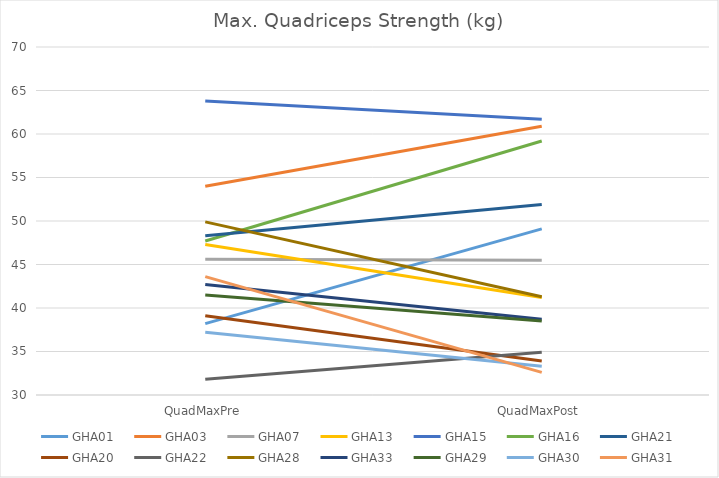
| Category | GHA01 | GHA03 | GHA07 | GHA13 | GHA15 | GHA16 | GHA21 | GHA20 | GHA22 | GHA28 | GHA33 | GHA29 | GHA30 | GHA31 |
|---|---|---|---|---|---|---|---|---|---|---|---|---|---|---|
| QuadMaxPre | 38.2 | 54 | 45.6 | 47.3 | 63.8 | 47.7 | 48.3 | 39.1 | 31.8 | 49.9 | 42.7 | 41.5 | 37.2 | 43.6 |
| QuadMaxPost | 49.1 | 60.9 | 45.5 | 41.2 | 61.7 | 59.2 | 51.9 | 33.9 | 34.9 | 41.3 | 38.7 | 38.5 | 33.3 | 32.6 |